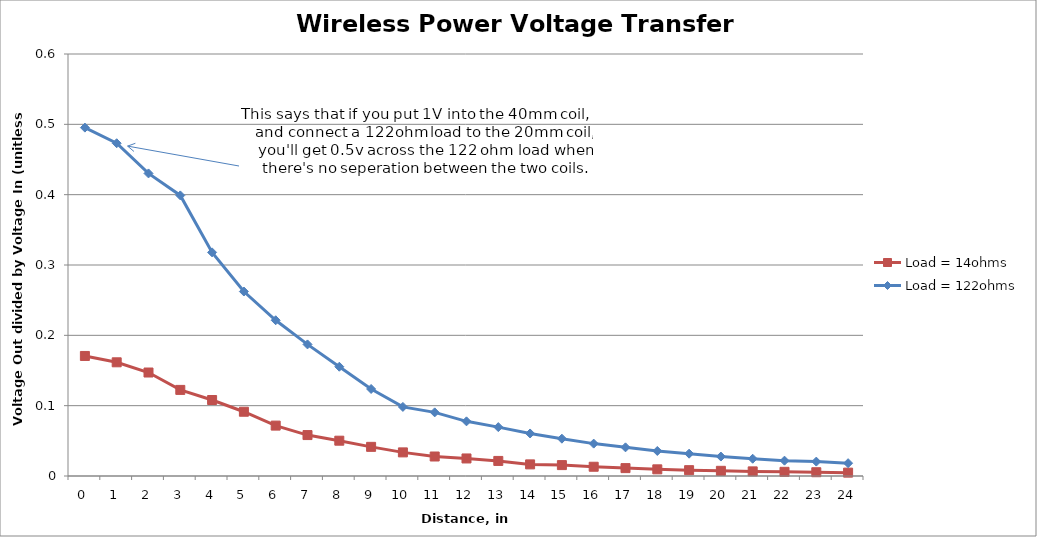
| Category | Load = 14ohms | Load = 122ohms |
|---|---|---|
| 0.0 | 0.171 | 0.495 |
| 1.0 | 0.162 | 0.473 |
| 2.0 | 0.147 | 0.43 |
| 3.0 | 0.122 | 0.399 |
| 4.0 | 0.108 | 0.318 |
| 5.0 | 0.091 | 0.262 |
| 6.0 | 0.072 | 0.221 |
| 7.0 | 0.058 | 0.187 |
| 8.0 | 0.05 | 0.155 |
| 9.0 | 0.041 | 0.124 |
| 10.0 | 0.034 | 0.098 |
| 11.0 | 0.028 | 0.09 |
| 12.0 | 0.025 | 0.078 |
| 13.0 | 0.021 | 0.07 |
| 14.0 | 0.017 | 0.06 |
| 15.0 | 0.015 | 0.053 |
| 16.0 | 0.013 | 0.046 |
| 17.0 | 0.011 | 0.041 |
| 18.0 | 0.009 | 0.036 |
| 19.0 | 0.008 | 0.032 |
| 20.0 | 0.007 | 0.028 |
| 21.0 | 0.007 | 0.025 |
| 22.0 | 0.006 | 0.022 |
| 23.0 | 0.005 | 0.02 |
| 24.0 | 0.005 | 0.018 |